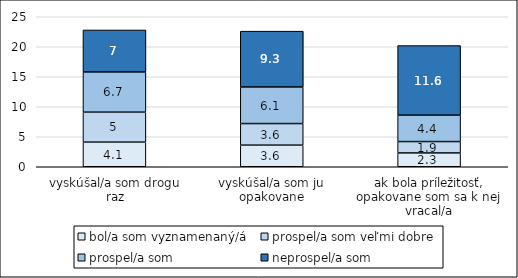
| Category | bol/a som vyznamenaný/á | prospel/a som veľmi dobre | prospel/a som | neprospel/a som |
|---|---|---|---|---|
| vyskúšal/a som drogu raz | 4.1 | 5 | 6.7 | 7 |
| vyskúšal/a som ju opakovane | 3.6 | 3.6 | 6.1 | 9.3 |
| ak bola príležitosť, opakovane som sa k nej vracal/a | 2.3 | 1.9 | 4.4 | 11.6 |